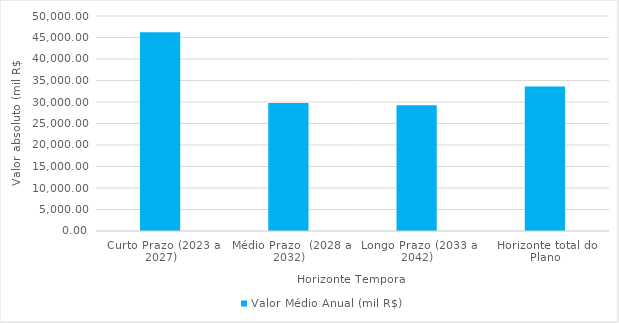
| Category | Valor Médio Anual (mil R$) |
|---|---|
| Curto Prazo (2023 a 2027) | 46206.086 |
| Médio Prazo  (2028 a 2032) | 29756.207 |
| Longo Prazo (2033 a 2042) | 29248.847 |
| Horizonte total do Plano | 33614.997 |